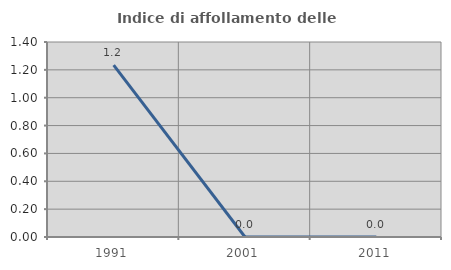
| Category | Indice di affollamento delle abitazioni  |
|---|---|
| 1991.0 | 1.235 |
| 2001.0 | 0 |
| 2011.0 | 0 |